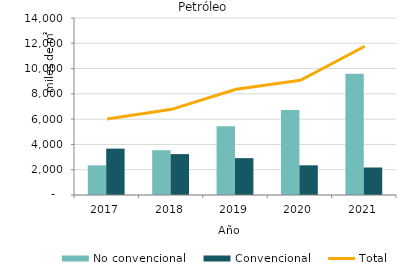
| Category | No convencional | Convencional |
|---|---|---|
| 2017.0 | 2344.029 | 3665.664 |
| 2018.0 | 3539.929 | 3234.655 |
| 2019.0 | 5442.771 | 2914.466 |
| 2020.0 | 6725.463 | 2348.401 |
| 2021.0 | 9591.2 | 2175.263 |